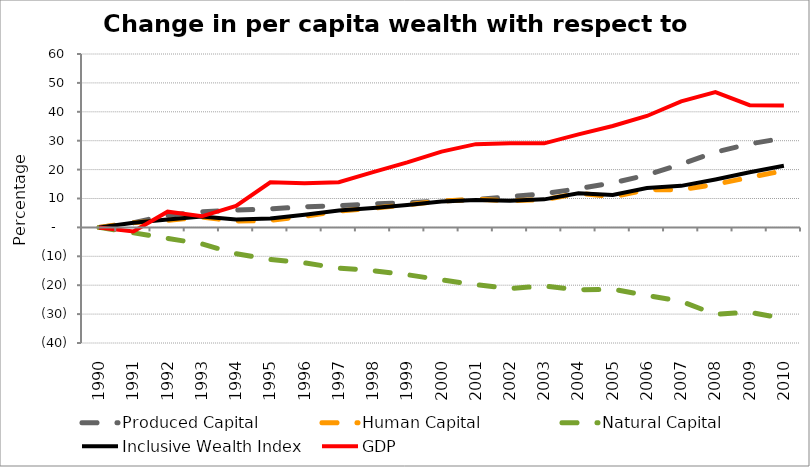
| Category | Produced Capital  | Human Capital | Natural Capital | Inclusive Wealth Index | GDP |
|---|---|---|---|---|---|
| 1990.0 | 0 | 0 | 0 | 0 | 0 |
| 1991.0 | 1.629 | 1.641 | -1.878 | 1.609 | -1.419 |
| 1992.0 | 4.226 | 2.426 | -3.798 | 2.712 | 5.451 |
| 1993.0 | 5.378 | 3.537 | -5.709 | 3.805 | 3.838 |
| 1994.0 | 5.964 | 2.155 | -9.096 | 2.776 | 7.45 |
| 1995.0 | 6.388 | 2.475 | -11.121 | 3.096 | 15.598 |
| 1996.0 | 7.153 | 3.862 | -12.288 | 4.344 | 15.293 |
| 1997.0 | 7.501 | 5.645 | -14.094 | 5.827 | 15.659 |
| 1998.0 | 8.133 | 6.626 | -14.964 | 6.726 | 19.102 |
| 1999.0 | 8.572 | 7.78 | -16.371 | 7.724 | 22.494 |
| 2000.0 | 9.086 | 9.168 | -18.165 | 8.921 | 26.209 |
| 2001.0 | 9.634 | 9.717 | -19.817 | 9.451 | 28.804 |
| 2002.0 | 10.622 | 9.257 | -21.161 | 9.255 | 29.076 |
| 2003.0 | 11.639 | 9.569 | -20.254 | 9.705 | 29.082 |
| 2004.0 | 13.407 | 11.832 | -21.613 | 11.844 | 32.208 |
| 2005.0 | 15.393 | 10.582 | -21.361 | 11.216 | 35.08 |
| 2006.0 | 18.118 | 12.996 | -23.544 | 13.65 | 38.551 |
| 2007.0 | 21.887 | 13.041 | -25.571 | 14.377 | 43.587 |
| 2008.0 | 26.026 | 14.893 | -30.095 | 16.605 | 46.807 |
| 2009.0 | 28.882 | 17.322 | -29.327 | 19.101 | 42.303 |
| 2010.0 | 30.891 | 19.616 | -31.544 | 21.302 | 42.208 |